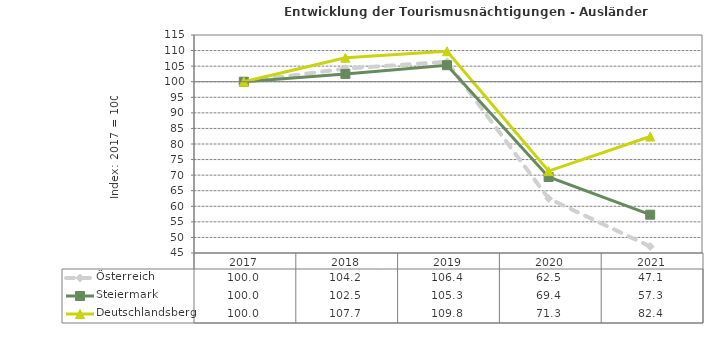
| Category | Österreich | Steiermark | Deutschlandsberg |
|---|---|---|---|
| 2021.0 | 47.1 | 57.3 | 82.4 |
| 2020.0 | 62.5 | 69.4 | 71.3 |
| 2019.0 | 106.4 | 105.3 | 109.8 |
| 2018.0 | 104.2 | 102.5 | 107.7 |
| 2017.0 | 100 | 100 | 100 |